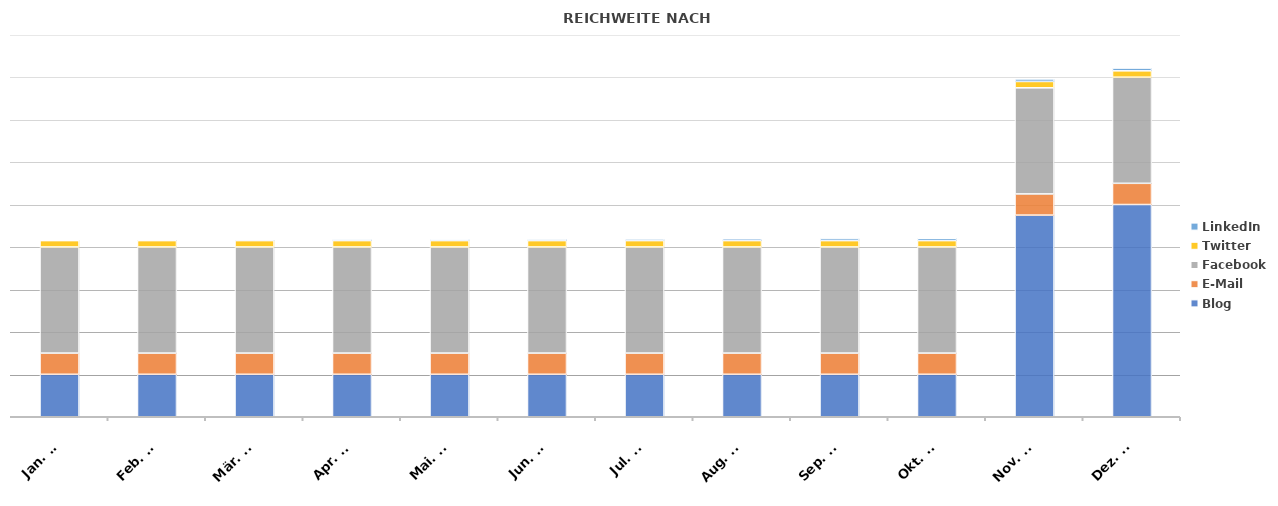
| Category | Blog | E-Mail | Facebook | Twitter | LinkedIn |
|---|---|---|---|---|---|
| 2022-01-18 | 200 | 100 | 500 | 30 | 2 |
| 2022-02-18 | 200 | 100 | 500 | 30 | 3 |
| 2022-03-18 | 200 | 100 | 500 | 30 | 4 |
| 2022-04-18 | 200 | 100 | 500 | 30 | 5 |
| 2022-05-18 | 200 | 100 | 500 | 30 | 6 |
| 2022-06-18 | 200 | 100 | 500 | 30 | 7 |
| 2022-07-18 | 200 | 100 | 500 | 30 | 8 |
| 2022-08-18 | 200 | 100 | 500 | 30 | 9 |
| 2022-09-18 | 200 | 100 | 500 | 30 | 10 |
| 2022-10-18 | 200 | 100 | 500 | 30 | 11 |
| 2022-11-18 | 950 | 100 | 500 | 30 | 12 |
| 2022-12-18 | 1000 | 100 | 500 | 30 | 13 |